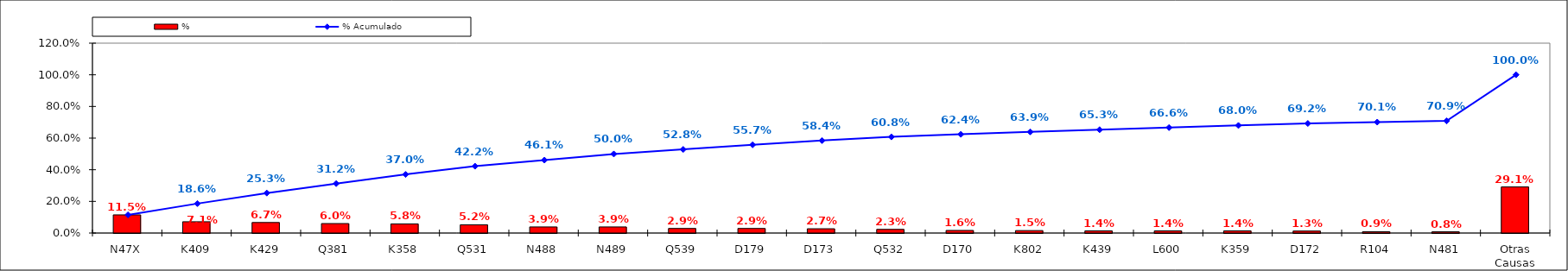
| Category | % |
|---|---|
| N47X | 0.115 |
| K409 | 0.071 |
| K429 | 0.067 |
| Q381 | 0.06 |
| K358 | 0.058 |
| Q531 | 0.052 |
| N488 | 0.039 |
| N489 | 0.039 |
| Q539 | 0.029 |
| D179 | 0.029 |
| D173 | 0.027 |
| Q532 | 0.023 |
| D170 | 0.016 |
| K802 | 0.015 |
| K439 | 0.014 |
| L600 | 0.014 |
| K359 | 0.014 |
| D172 | 0.013 |
| R104 | 0.009 |
| N481 | 0.008 |
| Otras Causas | 0.291 |